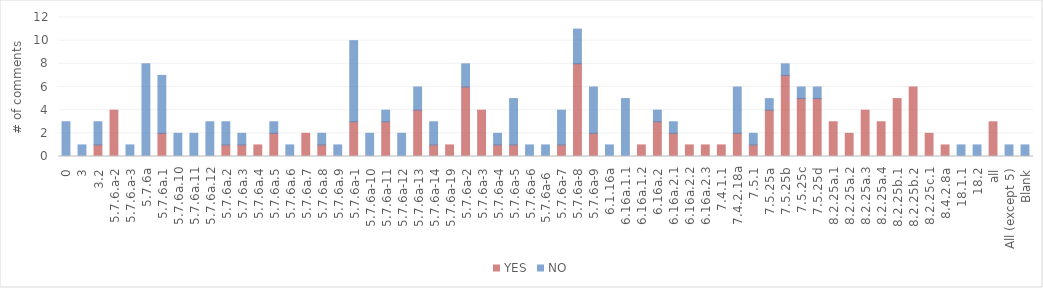
| Category | YES | NO |
|---|---|---|
| 0 | 0 | 3 |
| 3 | 0 | 1 |
| 3.2 | 1 | 2 |
| 5.7.6.a-2 | 4 | 0 |
| 5.7.6.a-3 | 0 | 1 |
| 5.7.6a | 0 | 8 |
| 5.7.6a.1 | 2 | 5 |
| 5.7.6a.10 | 0 | 2 |
| 5.7.6a.11 | 0 | 2 |
| 5.7.6a.12 | 0 | 3 |
| 5.7.6a.2 | 1 | 2 |
| 5.7.6a.3 | 1 | 1 |
| 5.7.6a.4 | 1 | 0 |
| 5.7.6a.5 | 2 | 1 |
| 5.7.6a.6 | 0 | 1 |
| 5.7.6a.7 | 2 | 0 |
| 5.7.6a.8 | 1 | 1 |
| 5.7.6a.9 | 0 | 1 |
| 5.7.6a-1 | 3 | 7 |
| 5.7.6a-10 | 0 | 2 |
| 5.7.6a-11 | 3 | 1 |
| 5.7.6a-12 | 0 | 2 |
| 5.7.6a-13 | 4 | 2 |
| 5.7.6a-14 | 1 | 2 |
| 5.7.6a-19 | 1 | 0 |
| 5.7.6a-2 | 6 | 2 |
| 5.7.6a-3 | 4 | 0 |
| 5.7.6a-4 | 1 | 1 |
| 5.7.6a-5 | 1 | 4 |
| 5.7.6a-6 | 0 | 1 |
| 5.7.6a-6  | 0 | 1 |
| 5.7.6a-7 | 1 | 3 |
| 5.7.6a-8 | 8 | 3 |
| 5.7.6a-9 | 2 | 4 |
| 6.1.16a | 0 | 1 |
| 6.16a.1.1 | 0 | 5 |
| 6.16a.1.2 | 1 | 0 |
| 6.16a.2 | 3 | 1 |
| 6.16a.2.1 | 2 | 1 |
| 6.16a.2.2 | 1 | 0 |
| 6.16a.2.3 | 1 | 0 |
| 7.4.1.1 | 1 | 0 |
| 7.4.2.18a | 2 | 4 |
| 7.5.1 | 1 | 1 |
| 7.5.25a | 4 | 1 |
| 7.5.25b | 7 | 1 |
| 7.5.25c | 5 | 1 |
| 7.5.25d | 5 | 1 |
| 8.2.25a.1 | 3 | 0 |
| 8.2.25a.2 | 2 | 0 |
| 8.2.25a.3 | 4 | 0 |
| 8.2.25a.4 | 3 | 0 |
| 8.2.25b.1 | 5 | 0 |
| 8.2.25b.2 | 6 | 0 |
| 8.2.25c.1 | 2 | 0 |
| 8.4.2.8a | 1 | 0 |
| 18.1.1 | 0 | 1 |
| 18.2 | 0 | 1 |
| all | 3 | 0 |
| All (except 5) | 0 | 1 |
| Blank | 0 | 1 |